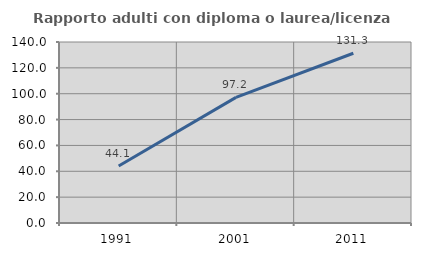
| Category | Rapporto adulti con diploma o laurea/licenza media  |
|---|---|
| 1991.0 | 44.086 |
| 2001.0 | 97.203 |
| 2011.0 | 131.288 |